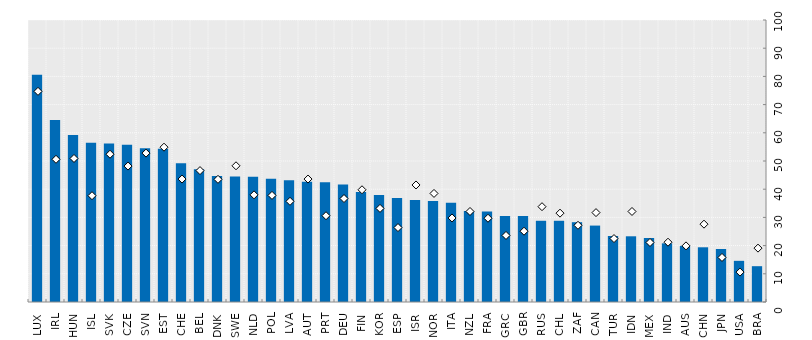
| Category | 2014 |
|---|---|
| LUX | 80.6 |
| IRL | 64.5 |
| HUN | 59.2 |
| ISL | 56.5 |
| SVK | 56.2 |
| CZE | 55.8 |
| SVN | 54.5 |
| EST | 54.3 |
| CHE | 49.2 |
| BEL | 47.1 |
| DNK | 44.7 |
| SWE | 44.5 |
| NLD | 44.4 |
| POL | 43.7 |
| LVA | 43.2 |
| AUT | 42.6 |
| PRT | 42.5 |
| DEU | 41.7 |
| FIN | 39 |
| KOR | 37.9 |
| ESP | 36.9 |
| ISR | 36.2 |
| NOR | 35.8 |
| ITA | 35.2 |
| NZL | 32.3 |
| FRA | 32.1 |
| GRC | 30.5 |
| GBR | 30.5 |
| RUS | 28.8 |
| CHL | 28.8 |
| ZAF | 28.3 |
| CAN | 27.1 |
| TUR | 23.4 |
| IDN | 23.3 |
| MEX | 22.7 |
| IND | 20.8 |
| AUS | 19.9 |
| CHN | 19.4 |
| JPN | 18.8 |
| USA | 14.6 |
| BRA | 12.7 |